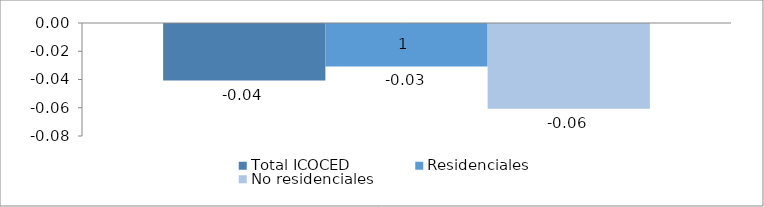
| Category | Total ICOCED | Residenciales | No residenciales |
|---|---|---|---|
| 0 | -0.04 | -0.03 | -0.06 |